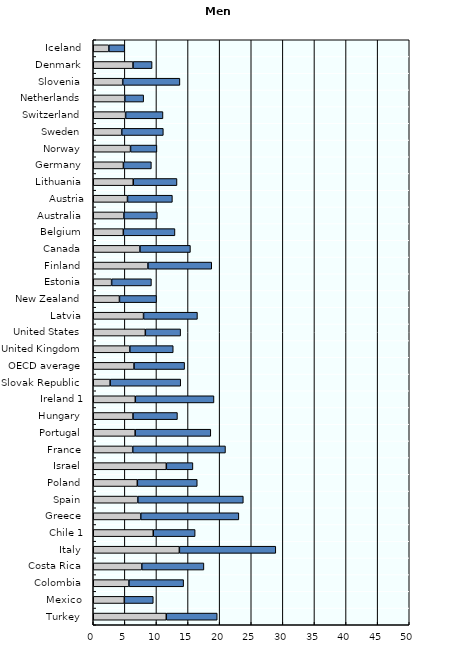
| Category | Inactive | Unemployed |
|---|---|---|
| Turkey  | 11.557 | 8.059 |
| Mexico  | 4.919 | 4.58 |
| Colombia  | 5.645 | 8.654 |
| Costa Rica  | 7.677 | 9.832 |
| Italy  | 13.626 | 15.259 |
| Chile 1 | 9.495 | 6.629 |
| Greece  | 7.516 | 15.522 |
| Spain  | 7.053 | 16.693 |
| Poland  | 6.977 | 9.481 |
| Israel  | 11.564 | 4.205 |
| France  | 6.247 | 14.674 |
| Portugal  | 6.632 | 11.968 |
| Hungary  | 6.288 | 7.035 |
| Ireland 1 | 6.654 | 12.448 |
| Slovak Republic  | 2.671 | 11.17 |
| OECD average  | 6.452 | 8.006 |
| United Kingdom  | 5.785 | 6.871 |
| United States  | 8.241 | 5.585 |
| Latvia  | 7.957 | 8.529 |
| New Zealand  | 4.147 | 5.865 |
| Estonia  | 2.907 | 6.297 |
| Finland  | 8.654 | 10.096 |
| Canada  | 7.385 | 7.99 |
| Belgium  | 4.76 | 8.17 |
| Australia  | 4.846 | 5.293 |
| Austria | 5.418 | 7.106 |
| Lithuania  | 6.328 | 6.923 |
| Germany  | 4.774 | 4.422 |
| Norway  | 5.897 | 4.177 |
| Sweden  | 4.503 | 6.585 |
| Switzerland  | 5.123 | 5.91 |
| Netherlands  | 4.991 | 2.986 |
| Slovenia  | 4.662 | 9.051 |
| Denmark  | 6.293 | 3.017 |
| Iceland  | 2.469 | 2.507 |